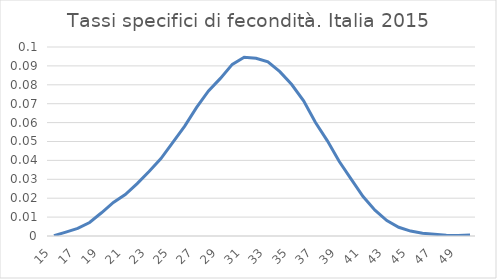
| Category | Series 0 |
|---|---|
| 15.0 | 0 |
| 16.0 | 0.002 |
| 17.0 | 0.004 |
| 18.0 | 0.007 |
| 19.0 | 0.012 |
| 20.0 | 0.018 |
| 21.0 | 0.022 |
| 22.0 | 0.028 |
| 23.0 | 0.034 |
| 24.0 | 0.041 |
| 25.0 | 0.05 |
| 26.0 | 0.058 |
| 27.0 | 0.068 |
| 28.0 | 0.077 |
| 29.0 | 0.083 |
| 30.0 | 0.091 |
| 31.0 | 0.095 |
| 32.0 | 0.094 |
| 33.0 | 0.092 |
| 34.0 | 0.087 |
| 35.0 | 0.08 |
| 36.0 | 0.072 |
| 37.0 | 0.06 |
| 38.0 | 0.05 |
| 39.0 | 0.039 |
| 40.0 | 0.03 |
| 41.0 | 0.021 |
| 42.0 | 0.014 |
| 43.0 | 0.008 |
| 44.0 | 0.005 |
| 45.0 | 0.003 |
| 46.0 | 0.001 |
| 47.0 | 0.001 |
| 48.0 | 0 |
| 49.0 | 0 |
| 50.0 | 0.001 |